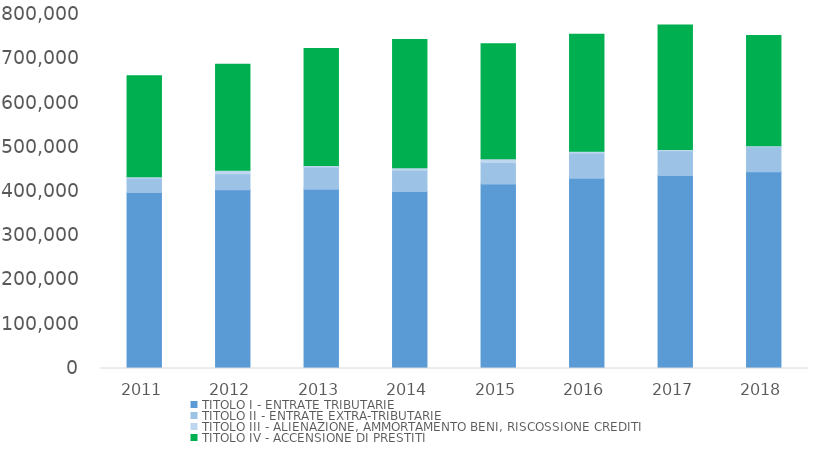
| Category | TITOLO I - ENTRATE TRIBUTARIE | TITOLO II - ENTRATE EXTRA-TRIBUTARIE | TITOLO III - ALIENAZIONE, AMMORTAMENTO BENI, RISCOSSIONE CREDITI | TITOLO IV - ACCENSIONE DI PRESTITI |
|---|---|---|---|---|
| 2011.0 | 397920.866 | 32084.896 | 3235.46 | 228422.129 |
| 2012.0 | 404223.451 | 35956.159 | 7888.953 | 239783.649 |
| 2013.0 | 405343.119 | 49819.799 | 3353.962 | 264846.999 |
| 2014.0 | 399719.603 | 48477.677 | 5424.732 | 289972.991 |
| 2015.0 | 416797.058 | 48665.553 | 8750.796 | 259542.417 |
| 2016.0 | 430133.794 | 56790.651 | 3756.401 | 264618.209 |
| 2017.0 | 436128.673 | 56159.986 | 2422.837 | 281609.658 |
| 2018.0 | 444572.682 | 56824.006 | 2115.122 | 249065.559 |